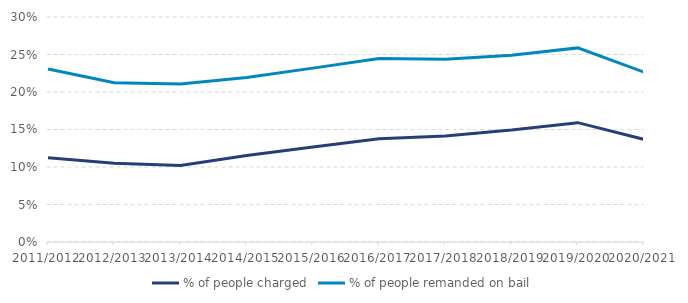
| Category | % of people charged | % of people remanded on bail |
|---|---|---|
| 2011/2012 | 0.112 | 0.231 |
| 2012/2013 | 0.105 | 0.212 |
| 2013/2014 | 0.102 | 0.211 |
| 2014/2015 | 0.115 | 0.219 |
| 2015/2016 | 0.127 | 0.232 |
| 2016/2017 | 0.138 | 0.245 |
| 2017/2018 | 0.141 | 0.244 |
| 2018/2019 | 0.149 | 0.249 |
| 2019/2020 | 0.159 | 0.259 |
| 2020/2021 | 0.137 | 0.226 |